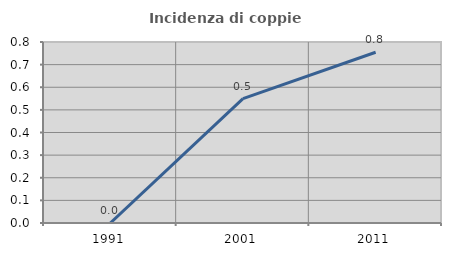
| Category | Incidenza di coppie miste |
|---|---|
| 1991.0 | 0 |
| 2001.0 | 0.549 |
| 2011.0 | 0.755 |